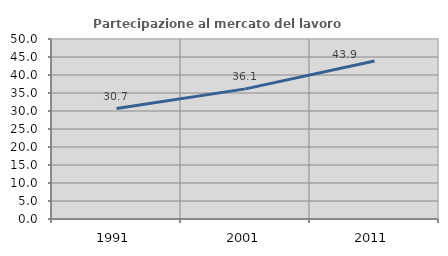
| Category | Partecipazione al mercato del lavoro  femminile |
|---|---|
| 1991.0 | 30.672 |
| 2001.0 | 36.145 |
| 2011.0 | 43.887 |